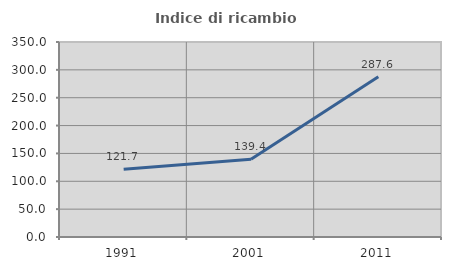
| Category | Indice di ricambio occupazionale  |
|---|---|
| 1991.0 | 121.711 |
| 2001.0 | 139.437 |
| 2011.0 | 287.629 |